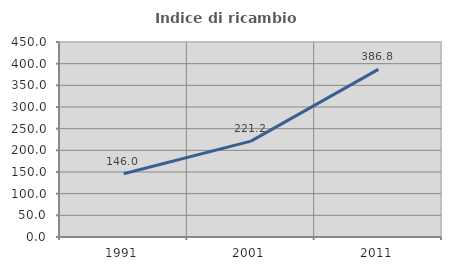
| Category | Indice di ricambio occupazionale  |
|---|---|
| 1991.0 | 146 |
| 2001.0 | 221.212 |
| 2011.0 | 386.842 |